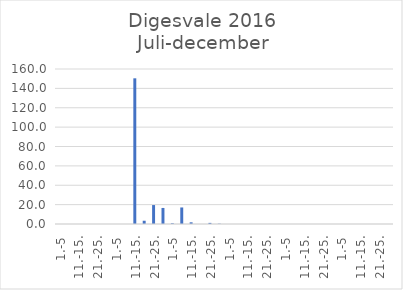
| Category | Series 0 |
|---|---|
| 1.-5 | 0 |
| 6.-10. | 0 |
| 11.-15. | 0 |
| 16.-20. | 0 |
| 21.-25. | 0 |
| 26.-31. | 0 |
| 1.-5 | 0 |
| 6.-10. | 0 |
| 11.-15. | 150.383 |
| 16.-20. | 3.375 |
| 21.-25. | 19.549 |
| 26.-31. | 16.564 |
| 1.-5 | 0.765 |
| 6.-10. | 17.074 |
| 11.-15. | 1.739 |
| 16.-20. | 0 |
| 21.-25. | 1.151 |
| 26.-30. | 0.323 |
| 1.-5 | 0.018 |
| 6.-10. | 0 |
| 11.-15. | 0 |
| 16.-20. | 0 |
| 21.-25. | 0 |
| 26.-31. | 0 |
| 1.-5 | 0 |
| 6.-10. | 0 |
| 11.-15. | 0 |
| 16.-20. | 0 |
| 21.-25. | 0 |
| 26.-30. | 0 |
| 1.-5 | 0 |
| 6.-10. | 0 |
| 11.-15. | 0 |
| 16.-20. | 0 |
| 21.-25. | 0 |
| 26.-31. | 0 |